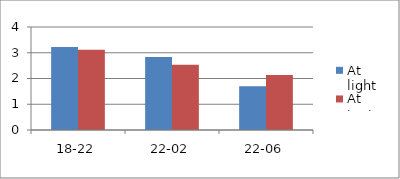
| Category | At light | At tent |
|---|---|---|
| 18-22 | 3.225 | 3.121 |
| 22-02 | 2.837 | 2.529 |
| 22-06 | 1.7 | 2.137 |